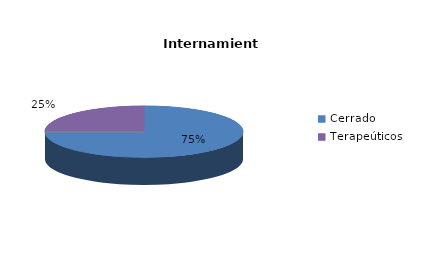
| Category | Series 0 |
|---|---|
| Cerrado | 3 |
| Semiabierto | 0 |
| Abierto | 0 |
| Terapeúticos | 1 |